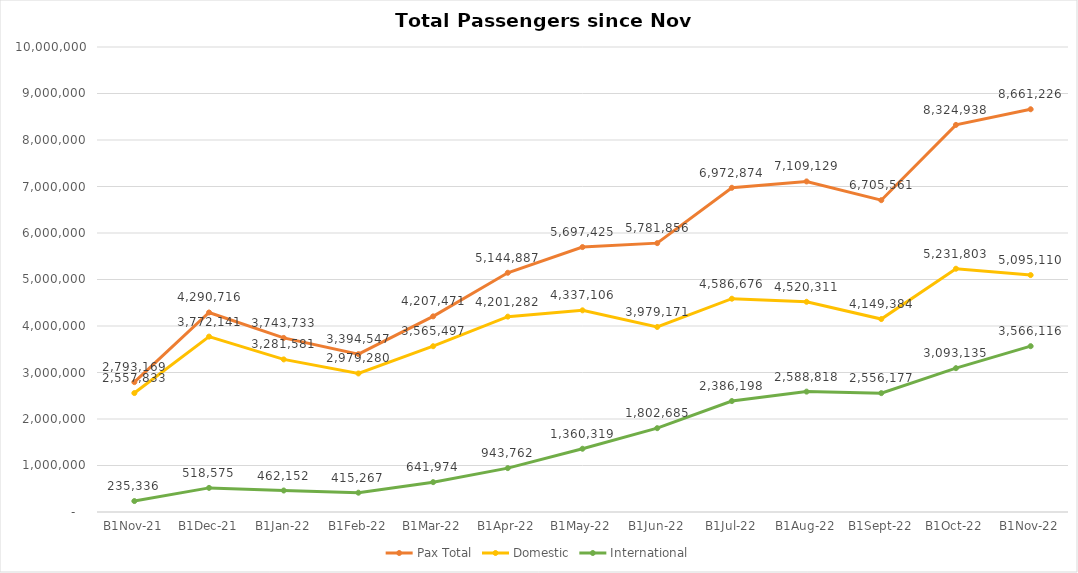
| Category | Pax Total |  Domestic  |  International  |
|---|---|---|---|
| 2021-11-01 | 2793169 | 2557833 | 235336 |
| 2021-12-01 | 4290716 | 3772141 | 518575 |
| 2022-01-01 | 3743733 | 3281581 | 462152 |
| 2022-02-01 | 3394547 | 2979280 | 415267 |
| 2022-03-01 | 4207471 | 3565497 | 641974 |
| 2022-04-01 | 5144887 | 4201282 | 943762 |
| 2022-05-01 | 5697425 | 4337106 | 1360319 |
| 2022-06-01 | 5781856 | 3979171 | 1802685 |
| 2022-07-01 | 6972874 | 4586676 | 2386198 |
| 2022-08-01 | 7109129 | 4520311 | 2588818 |
| 2022-09-01 | 6705561 | 4149384 | 2556177 |
| 2022-10-01 | 8324938 | 5231803 | 3093135 |
| 2022-11-01 | 8661226 | 5095110 | 3566116 |